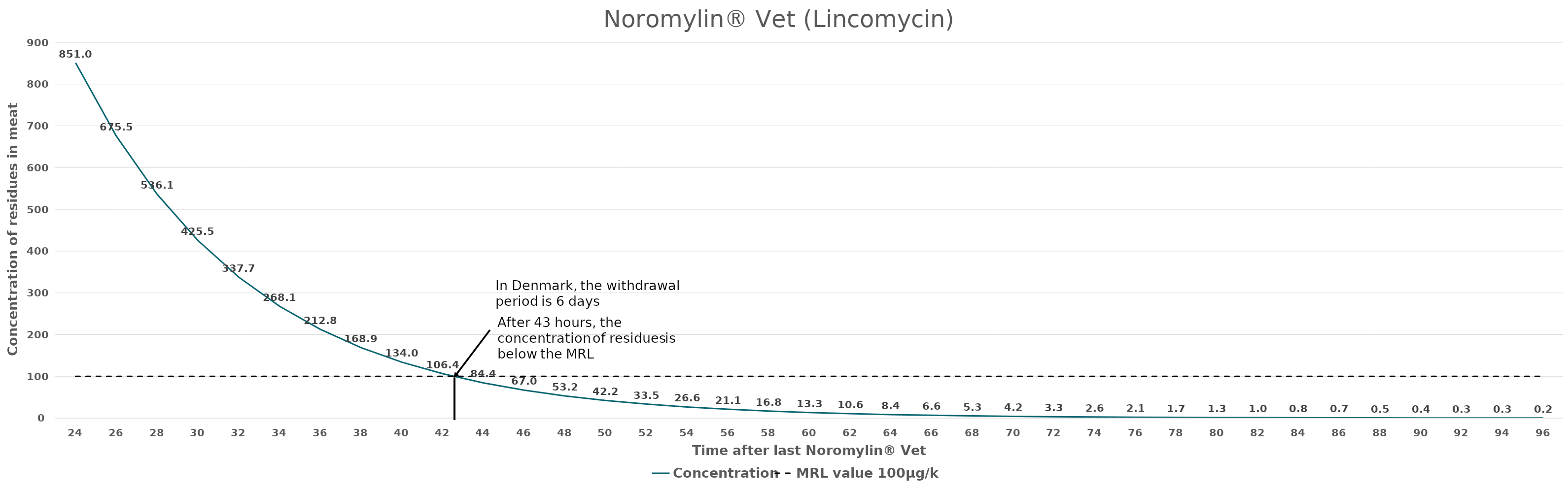
| Category | Concentration | MRL value 100μg/kg |
|---|---|---|
| 24.0 | 851.035 | 100 |
| 26.0 | 675.467 | 100 |
| 28.0 | 536.118 | 100 |
| 30.0 | 425.517 | 100 |
| 32.0 | 337.733 | 100 |
| 34.0 | 268.059 | 100 |
| 36.0 | 212.759 | 100 |
| 38.0 | 168.867 | 100 |
| 40.0 | 134.03 | 100 |
| 42.0 | 106.379 | 100 |
| 44.0 | 84.433 | 100 |
| 46.0 | 67.015 | 100 |
| 48.0 | 53.19 | 100 |
| 50.0 | 42.217 | 100 |
| 52.0 | 33.507 | 100 |
| 54.0 | 26.595 | 100 |
| 56.0 | 21.108 | 100 |
| 58.0 | 16.754 | 100 |
| 60.0 | 13.297 | 100 |
| 62.0 | 10.554 | 100 |
| 64.0 | 8.377 | 100 |
| 66.0 | 6.649 | 100 |
| 68.0 | 5.277 | 100 |
| 70.0 | 4.188 | 100 |
| 72.0 | 3.324 | 100 |
| 74.0 | 2.639 | 100 |
| 76.0 | 2.094 | 100 |
| 78.0 | 1.662 | 100 |
| 80.0 | 1.319 | 100 |
| 82.0 | 1.047 | 100 |
| 84.0 | 0.831 | 100 |
| 86.0 | 0.66 | 100 |
| 88.0 | 0.524 | 100 |
| 90.0 | 0.416 | 100 |
| 92.0 | 0.33 | 100 |
| 94.0 | 0.262 | 100 |
| 96.0 | 0.208 | 100 |